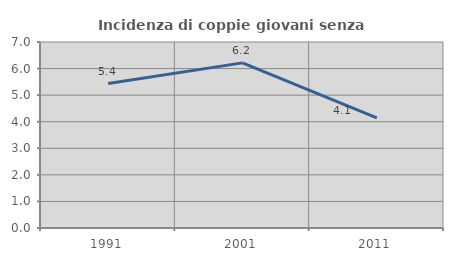
| Category | Incidenza di coppie giovani senza figli |
|---|---|
| 1991.0 | 5.435 |
| 2001.0 | 6.215 |
| 2011.0 | 4.142 |